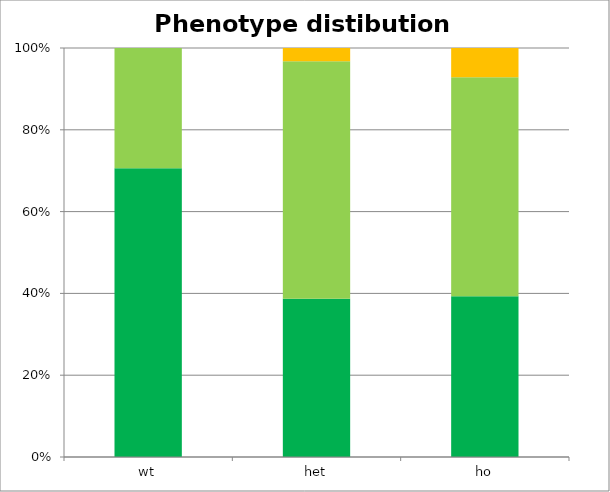
| Category | cat 1 | cat 2 | cat 3 | cat 4 |
|---|---|---|---|---|
| wt | 12 | 5 | 0 | 0 |
| het | 12 | 18 | 1 | 0 |
| ho | 11 | 15 | 2 | 0 |